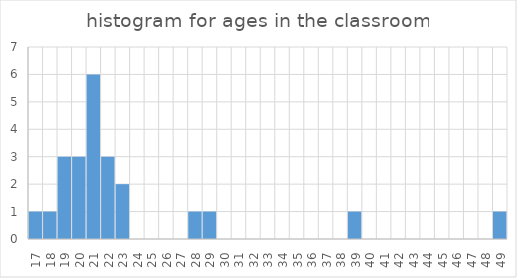
| Category | freq |
|---|---|
| 17.0 | 1 |
| 18.0 | 1 |
| 19.0 | 3 |
| 20.0 | 3 |
| 21.0 | 6 |
| 22.0 | 3 |
| 23.0 | 2 |
| 24.0 | 0 |
| 25.0 | 0 |
| 26.0 | 0 |
| 27.0 | 0 |
| 28.0 | 1 |
| 29.0 | 1 |
| 30.0 | 0 |
| 31.0 | 0 |
| 32.0 | 0 |
| 33.0 | 0 |
| 34.0 | 0 |
| 35.0 | 0 |
| 36.0 | 0 |
| 37.0 | 0 |
| 38.0 | 0 |
| 39.0 | 1 |
| 40.0 | 0 |
| 41.0 | 0 |
| 42.0 | 0 |
| 43.0 | 0 |
| 44.0 | 0 |
| 45.0 | 0 |
| 46.0 | 0 |
| 47.0 | 0 |
| 48.0 | 0 |
| 49.0 | 1 |